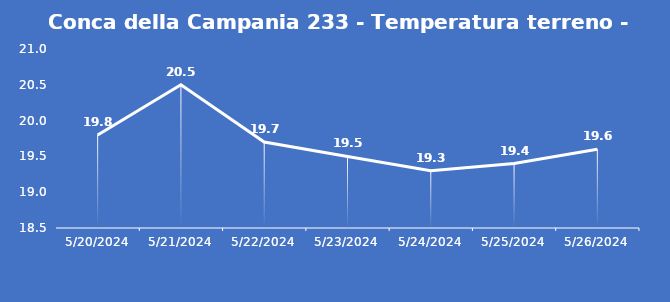
| Category | Conca della Campania 233 - Temperatura terreno - Grezzo (°C) |
|---|---|
| 5/20/24 | 19.8 |
| 5/21/24 | 20.5 |
| 5/22/24 | 19.7 |
| 5/23/24 | 19.5 |
| 5/24/24 | 19.3 |
| 5/25/24 | 19.4 |
| 5/26/24 | 19.6 |